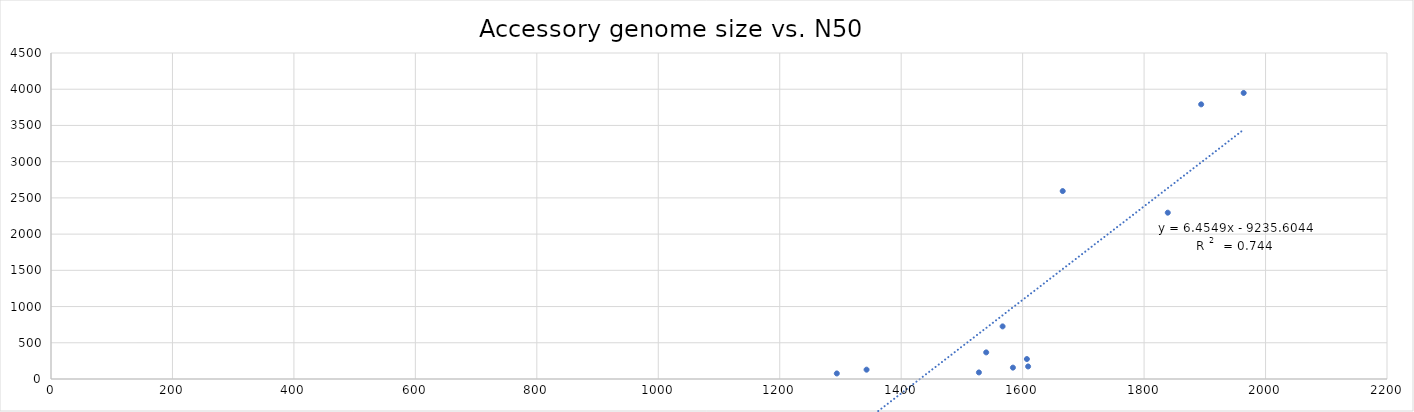
| Category | Series 0 |
|---|---|
| 1894.0 | 3791.214 |
| 1584.0 | 156.847 |
| 1609.0 | 172.994 |
| 1964.0 | 3948.441 |
| 1528.0 | 90.675 |
| 1294.0 | 76.555 |
| 1540.0 | 367.421 |
| 1607.0 | 275.468 |
| 1666.0 | 2594.13 |
| 1567.0 | 726.133 |
| 1343.0 | 128.808 |
| 1839.0 | 2295.917 |